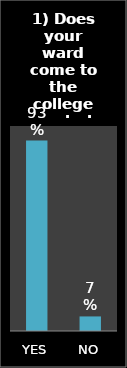
| Category | Series 0 |
|---|---|
| YES | 0.929 |
| NO | 0.071 |